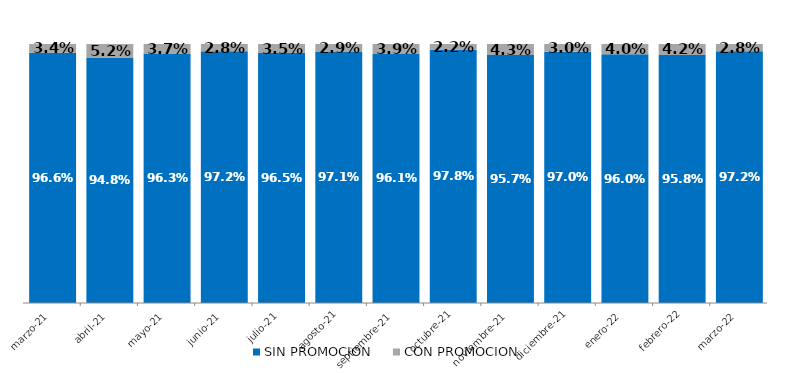
| Category | SIN PROMOCION   | CON PROMOCION   |
|---|---|---|
| 2021-03-01 | 0.966 | 0.034 |
| 2021-04-01 | 0.948 | 0.052 |
| 2021-05-01 | 0.963 | 0.037 |
| 2021-06-01 | 0.972 | 0.028 |
| 2021-07-01 | 0.965 | 0.035 |
| 2021-08-01 | 0.971 | 0.029 |
| 2021-09-01 | 0.961 | 0.039 |
| 2021-10-01 | 0.978 | 0.022 |
| 2021-11-01 | 0.957 | 0.043 |
| 2021-12-01 | 0.97 | 0.03 |
| 2022-01-01 | 0.96 | 0.04 |
| 2022-02-01 | 0.958 | 0.042 |
| 2022-03-01 | 0.972 | 0.028 |